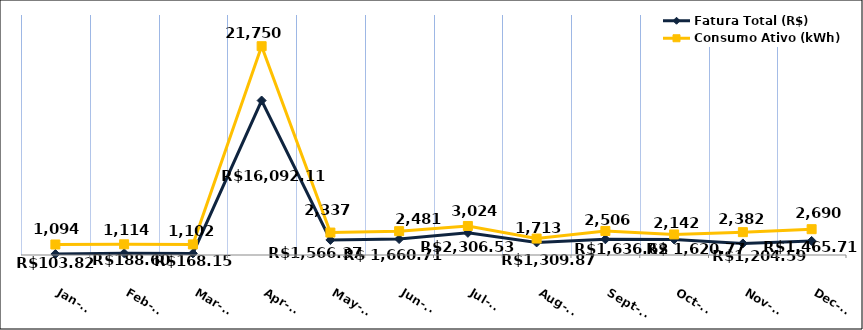
| Category | Fatura Total (R$) |
|---|---|
| 2023-01-01 | 103.82 |
| 2023-02-01 | 188.6 |
| 2023-03-01 | 168.15 |
| 2023-04-01 | 16092.11 |
| 2023-05-01 | 1566.37 |
| 2023-06-01 | 1660.71 |
| 2023-07-01 | 2306.53 |
| 2023-08-01 | 1309.87 |
| 2023-09-01 | 1636.62 |
| 2023-10-01 | 1620.77 |
| 2023-11-01 | 1204.59 |
| 2023-12-01 | 1465.71 |